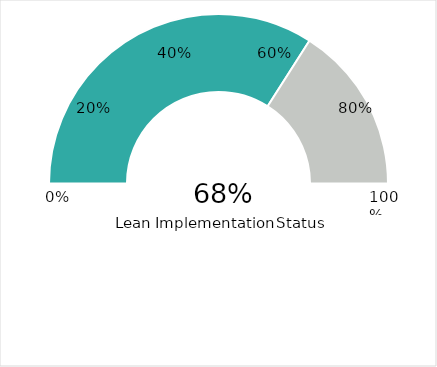
| Category | Series 0 |
|---|---|
| 0 | 0.681 |
| 1 | 0.319 |
| 2 | 1 |